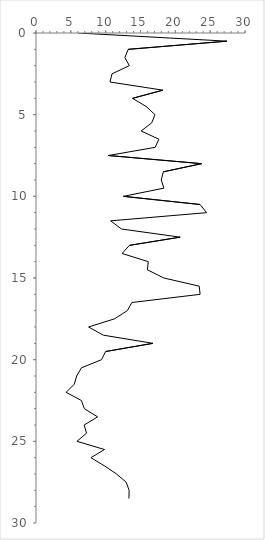
| Category | Series 0 |
|---|---|
| 6.041567883673147 | 0 |
| 27.40740740740741 | 0.5 |
| 13.234904748666217 | 1 |
| 12.75995246583482 | 1.5 |
| 13.40007215007215 | 2 |
| 10.910518053375197 | 2.5 |
| 10.621556626069378 | 3 |
| 18.208750347511817 | 3.5 |
| 13.856513856513857 | 4 |
| 15.825825825825826 | 4.5 |
| 17.07828894269572 | 5 |
| 16.608928319954938 | 5.5 |
| 15.091235924569256 | 6 |
| 17.634680134680135 | 6.5 |
| 17.10420602349467 | 7 |
| 10.393967885257084 | 7.5 |
| 23.768987196549034 | 8 |
| 18.27020202020202 | 8.5 |
| 17.97979797979798 | 9 |
| 18.361742424242426 | 9.5 |
| 12.542087542087543 | 10 |
| 23.54978354978355 | 10.5 |
| 24.496754004950727 | 11 |
| 10.71383883883884 | 11.5 |
| 12.266627628946468 | 12 |
| 20.68903318903319 | 12.5 |
| 13.415159345391904 | 13 |
| 12.362707535121325 | 13.5 |
| 16.116554234928795 | 14 |
| 15.991285403050108 | 14.5 |
| 18.363505329848227 | 15 |
| 23.43304843304843 | 15.5 |
| 23.555320648343905 | 16 |
| 13.763763763763762 | 16.5 |
| 13.105413105413106 | 17 |
| 11.26984126984127 | 17.5 |
| 7.542087542087542 | 18 |
| 9.66053982447425 | 18.5 |
| 16.783216783216783 | 19 |
| 9.997585853099162 | 19.5 |
| 9.409929572058028 | 20 |
| 6.524294820412993 | 20.5 |
| 5.838274044795784 | 21 |
| 5.493265637120089 | 21.5 |
| 4.328165374677003 | 22 |
| 6.519629795491864 | 22.5 |
| 6.933146330060775 | 23 |
| 8.842192560258217 | 23.5 |
| 6.91358024691358 | 24 |
| 7.2592592592592595 | 24.5 |
| 5.882473479295723 | 25 |
| 9.835194045720362 | 25.5 |
| 7.885521885521885 | 26 |
| 9.814814814814815 | 26.5 |
| 11.566111566111568 | 27 |
| 12.93891293891294 | 27.5 |
| 13.365209471766848 | 28 |
| 13.333333333333334 | 28.5 |